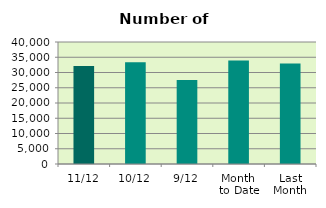
| Category | Series 0 |
|---|---|
| 11/12 | 32104 |
| 10/12 | 33334 |
| 9/12 | 27510 |
| Month 
to Date | 33951 |
| Last
Month | 32932.667 |